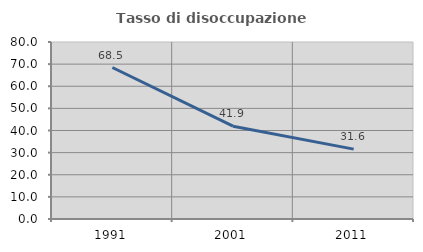
| Category | Tasso di disoccupazione giovanile  |
|---|---|
| 1991.0 | 68.468 |
| 2001.0 | 41.935 |
| 2011.0 | 31.579 |